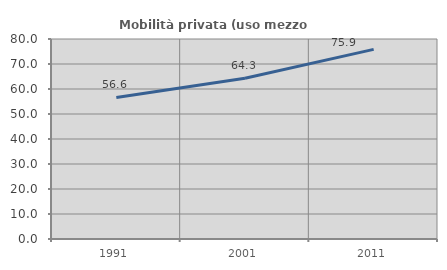
| Category | Mobilità privata (uso mezzo privato) |
|---|---|
| 1991.0 | 56.604 |
| 2001.0 | 64.286 |
| 2011.0 | 75.862 |